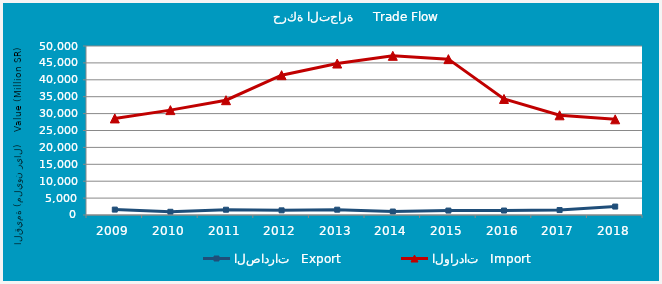
| Category | الصادرات   Export | الواردات   Import |
|---|---|---|
| 2009.0 | 1597557496 | 28572398114 |
| 2010.0 | 951752226 | 31032431751 |
| 2011.0 | 1559715090 | 33964069857 |
| 2012.0 | 1377558604 | 41367327076 |
| 2013.0 | 1570407291 | 44811962317 |
| 2014.0 | 1025671824 | 47092831060 |
| 2015.0 | 1311439655 | 46115773026 |
| 2016.0 | 1317634484 | 34330966718 |
| 2017.0 | 1461166433 | 29496947826 |
| 2018.0 | 2495996180 | 28306352676 |